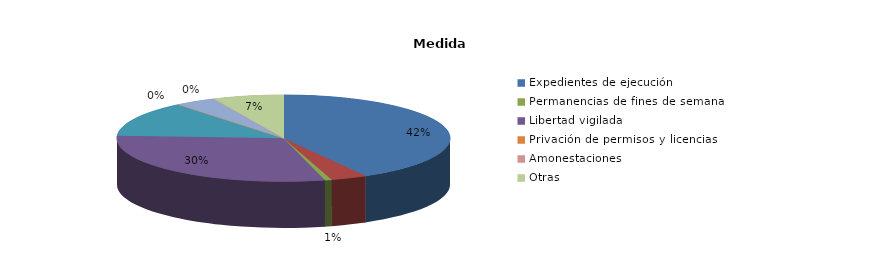
| Category | Series 0 |
|---|---|
| Expedientes de ejecución | 189 |
| Internamientos | 16 |
| Permanencias de fines de semana | 3 |
| Libertad vigilada | 135 |
| Prestaciones en beneficio de la comunidad | 60 |
| Privación de permisos y licencias | 0 |
| Convivencia Familiar Educativa | 18 |
| Amonestaciones | 0 |
| Otras | 31 |